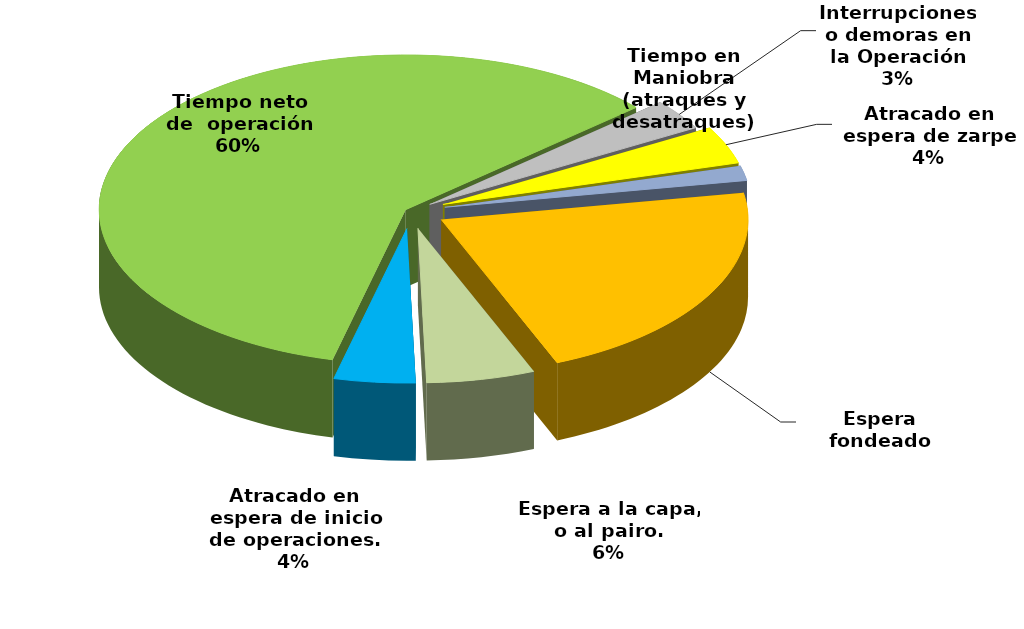
| Category | Series 0 |
|---|---|
| Espera fondeado | 44709.85 |
| Espera a la capa, o al pairo. | 11818.833 |
| Atracado en espera de inicio de operaciones. | 8870.716 |
| Tiempo neto de  operación | 123467.689 |
| Interrupciones o demoras en la Operación | 6657.03 |
| Atracado en espera de zarpe | 8133.091 |
| Tiempo en Maniobra (atraques y desatraques) | 3225.433 |